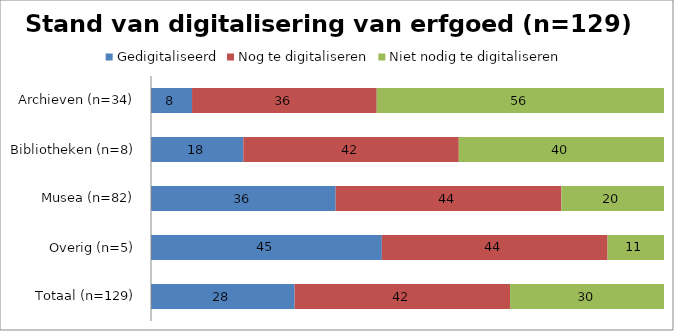
| Category | Gedigitaliseerd | Nog te digitaliseren | Niet nodig te digitaliseren |
|---|---|---|---|
| Totaal (n=129) | 28 | 42 | 30 |
| Overig (n=5) | 45 | 44 | 11 |
| Musea (n=82) | 36 | 44 | 20 |
| Bibliotheken (n=8) | 18 | 42 | 40 |
| Archieven (n=34) | 8 | 36 | 56 |